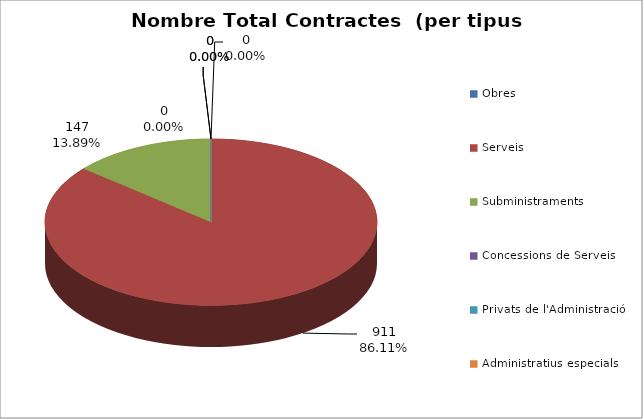
| Category | Nombre Total Contractes |
|---|---|
| Obres | 0 |
| Serveis | 911 |
| Subministraments | 147 |
| Concessions de Serveis | 0 |
| Privats de l'Administració | 0 |
| Administratius especials | 0 |